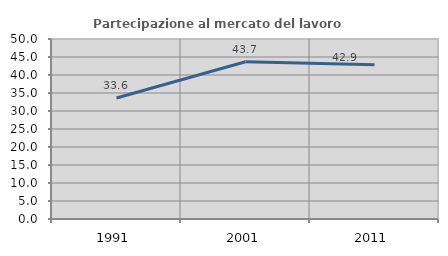
| Category | Partecipazione al mercato del lavoro  femminile |
|---|---|
| 1991.0 | 33.613 |
| 2001.0 | 43.692 |
| 2011.0 | 42.857 |